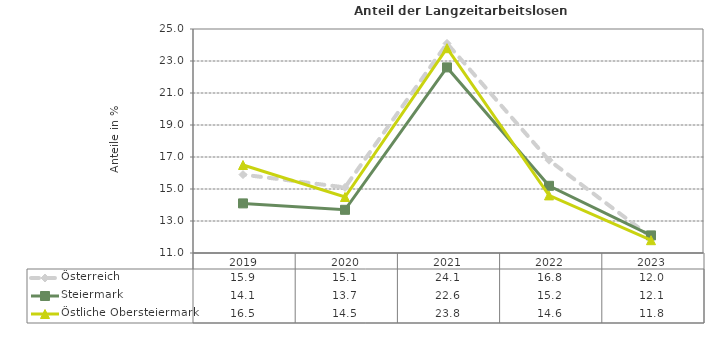
| Category | Österreich | Steiermark | Östliche Obersteiermark |
|---|---|---|---|
| 2023.0 | 12 | 12.1 | 11.8 |
| 2022.0 | 16.8 | 15.2 | 14.6 |
| 2021.0 | 24.1 | 22.6 | 23.8 |
| 2020.0 | 15.1 | 13.7 | 14.5 |
| 2019.0 | 15.9 | 14.1 | 16.5 |